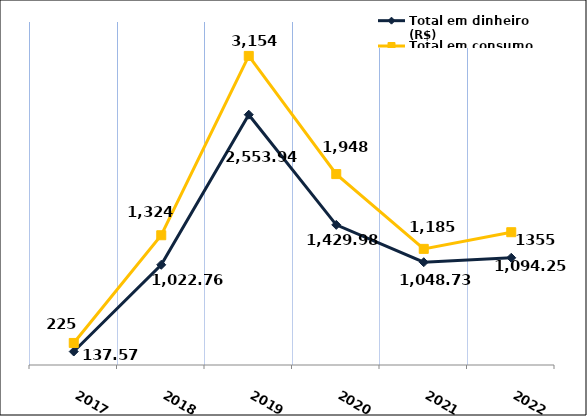
| Category | Total em dinheiro (R$) |
|---|---|
| 2017.0 | 137.57 |
| 2018.0 | 1022.76 |
| 2019.0 | 2553.94 |
| 2020.0 | 1429.98 |
| 2021.0 | 1048.73 |
| 2022.0 | 1094.25 |